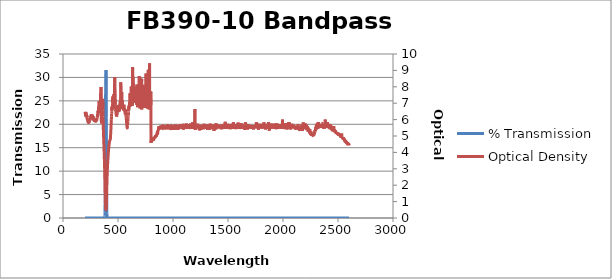
| Category | % Transmission |
|---|---|
| 2600.0 | 0.003 |
| 2599.0 | 0.004 |
| 2598.0 | 0.003 |
| 2597.0 | 0.003 |
| 2596.0 | 0.003 |
| 2595.0 | 0.003 |
| 2594.0 | 0.003 |
| 2593.0 | 0.004 |
| 2592.0 | 0.003 |
| 2591.0 | 0.003 |
| 2590.0 | 0.003 |
| 2589.0 | 0.003 |
| 2588.0 | 0.003 |
| 2587.0 | 0.003 |
| 2586.0 | 0.003 |
| 2585.0 | 0.003 |
| 2584.0 | 0.002 |
| 2583.0 | 0.003 |
| 2582.0 | 0.003 |
| 2581.0 | 0.003 |
| 2580.0 | 0.003 |
| 2579.0 | 0.003 |
| 2578.0 | 0.003 |
| 2577.0 | 0.002 |
| 2576.0 | 0.002 |
| 2575.0 | 0.002 |
| 2574.0 | 0.002 |
| 2573.0 | 0.002 |
| 2572.0 | 0.002 |
| 2571.0 | 0.002 |
| 2570.0 | 0.002 |
| 2569.0 | 0.002 |
| 2568.0 | 0.002 |
| 2567.0 | 0.002 |
| 2566.0 | 0.002 |
| 2565.0 | 0.002 |
| 2564.0 | 0.002 |
| 2563.0 | 0.002 |
| 2562.0 | 0.002 |
| 2561.0 | 0.002 |
| 2560.0 | 0.002 |
| 2559.0 | 0.002 |
| 2558.0 | 0.002 |
| 2557.0 | 0.002 |
| 2556.0 | 0.002 |
| 2555.0 | 0.002 |
| 2554.0 | 0.002 |
| 2553.0 | 0.001 |
| 2552.0 | 0.002 |
| 2551.0 | 0.001 |
| 2550.0 | 0.002 |
| 2549.0 | 0.002 |
| 2548.0 | 0.001 |
| 2547.0 | 0.002 |
| 2546.0 | 0.001 |
| 2545.0 | 0.001 |
| 2544.0 | 0.001 |
| 2543.0 | 0.001 |
| 2542.0 | 0.001 |
| 2541.0 | 0.001 |
| 2540.0 | 0.001 |
| 2539.0 | 0.001 |
| 2538.0 | 0.001 |
| 2537.0 | 0.001 |
| 2536.0 | 0.001 |
| 2535.0 | 0.001 |
| 2534.0 | 0.001 |
| 2533.0 | 0.001 |
| 2532.0 | 0.001 |
| 2531.0 | 0.001 |
| 2530.0 | 0.001 |
| 2529.0 | 0.001 |
| 2528.0 | 0.001 |
| 2527.0 | 0.001 |
| 2526.0 | 0.001 |
| 2525.0 | 0.001 |
| 2524.0 | 0.001 |
| 2523.0 | 0.001 |
| 2522.0 | 0.001 |
| 2521.0 | 0.001 |
| 2520.0 | 0.001 |
| 2519.0 | 0.001 |
| 2518.0 | 0.001 |
| 2517.0 | 0.001 |
| 2516.0 | 0.001 |
| 2515.0 | 0.001 |
| 2514.0 | 0.001 |
| 2513.0 | 0.001 |
| 2512.0 | 0.001 |
| 2511.0 | 0.001 |
| 2510.0 | 0.001 |
| 2509.0 | 0.001 |
| 2508.0 | 0.001 |
| 2507.0 | 0.001 |
| 2506.0 | 0.001 |
| 2505.0 | 0.001 |
| 2504.0 | 0.001 |
| 2503.0 | 0.001 |
| 2502.0 | 0.001 |
| 2501.0 | 0.001 |
| 2500.0 | 0.001 |
| 2499.0 | 0.001 |
| 2498.0 | 0.001 |
| 2497.0 | 0.001 |
| 2496.0 | 0.001 |
| 2495.0 | 0.001 |
| 2494.0 | 0.001 |
| 2493.0 | 0.001 |
| 2492.0 | 0.001 |
| 2491.0 | 0.001 |
| 2490.0 | 0.001 |
| 2489.0 | 0.001 |
| 2488.0 | 0.001 |
| 2487.0 | 0.001 |
| 2486.0 | 0.001 |
| 2485.0 | 0.001 |
| 2484.0 | 0.001 |
| 2483.0 | 0.001 |
| 2482.0 | 0.001 |
| 2481.0 | 0.001 |
| 2480.0 | 0.001 |
| 2479.0 | 0.001 |
| 2478.0 | 0 |
| 2477.0 | 0.001 |
| 2476.0 | 0.001 |
| 2475.0 | 0.001 |
| 2474.0 | 0.001 |
| 2473.0 | 0.001 |
| 2472.0 | 0 |
| 2471.0 | 0.001 |
| 2470.0 | 0 |
| 2469.0 | 0 |
| 2468.0 | 0.001 |
| 2467.0 | 0 |
| 2466.0 | 0 |
| 2465.0 | 0 |
| 2464.0 | 0 |
| 2463.0 | 0 |
| 2462.0 | 0 |
| 2461.0 | 0 |
| 2460.0 | 0 |
| 2459.0 | 0 |
| 2458.0 | 0 |
| 2457.0 | 0.001 |
| 2456.0 | 0 |
| 2455.0 | 0.001 |
| 2454.0 | 0 |
| 2453.0 | 0 |
| 2452.0 | 0 |
| 2451.0 | 0 |
| 2450.0 | 0 |
| 2449.0 | 0 |
| 2448.0 | 0 |
| 2447.0 | 0 |
| 2446.0 | 0 |
| 2445.0 | 0 |
| 2444.0 | 0 |
| 2443.0 | 0 |
| 2442.0 | 0 |
| 2441.0 | 0 |
| 2440.0 | 0 |
| 2439.0 | 0 |
| 2438.0 | 0 |
| 2437.0 | 0 |
| 2436.0 | 0 |
| 2435.0 | 0 |
| 2434.0 | 0 |
| 2433.0 | 0 |
| 2432.0 | 0 |
| 2431.0 | 0 |
| 2430.0 | 0 |
| 2429.0 | 0 |
| 2428.0 | 0 |
| 2427.0 | 0 |
| 2426.0 | 0 |
| 2425.0 | 0 |
| 2424.0 | 0 |
| 2423.0 | 0 |
| 2422.0 | 0 |
| 2421.0 | 0 |
| 2420.0 | 0 |
| 2419.0 | 0 |
| 2418.0 | 0 |
| 2417.0 | 0 |
| 2416.0 | 0 |
| 2415.0 | 0 |
| 2414.0 | 0 |
| 2413.0 | 0 |
| 2412.0 | 0 |
| 2411.0 | 0 |
| 2410.0 | 0 |
| 2409.0 | 0 |
| 2408.0 | 0 |
| 2407.0 | 0 |
| 2406.0 | 0 |
| 2405.0 | 0 |
| 2404.0 | 0 |
| 2403.0 | 0 |
| 2402.0 | 0 |
| 2401.0 | 0 |
| 2400.0 | 0 |
| 2399.0 | 0 |
| 2398.0 | 0 |
| 2397.0 | 0 |
| 2396.0 | 0 |
| 2395.0 | 0 |
| 2394.0 | 0 |
| 2393.0 | 0 |
| 2392.0 | 0 |
| 2391.0 | 0 |
| 2390.0 | 0 |
| 2389.0 | 0 |
| 2388.0 | 0 |
| 2387.0 | 0 |
| 2386.0 | 0 |
| 2385.0 | 0 |
| 2384.0 | 0 |
| 2383.0 | 0 |
| 2382.0 | 0 |
| 2381.0 | 0 |
| 2380.0 | 0 |
| 2379.0 | 0 |
| 2378.0 | 0 |
| 2377.0 | 0 |
| 2376.0 | 0 |
| 2375.0 | 0 |
| 2374.0 | 0 |
| 2373.0 | 0 |
| 2372.0 | 0 |
| 2371.0 | 0 |
| 2370.0 | 0 |
| 2369.0 | 0 |
| 2368.0 | 0 |
| 2367.0 | 0 |
| 2366.0 | 0 |
| 2365.0 | 0 |
| 2364.0 | 0 |
| 2363.0 | 0 |
| 2362.0 | 0 |
| 2361.0 | 0 |
| 2360.0 | 0 |
| 2359.0 | 0 |
| 2358.0 | 0 |
| 2357.0 | 0 |
| 2356.0 | 0 |
| 2355.0 | 0 |
| 2354.0 | 0 |
| 2353.0 | 0 |
| 2352.0 | 0 |
| 2351.0 | 0 |
| 2350.0 | 0 |
| 2349.0 | 0 |
| 2348.0 | 0 |
| 2347.0 | 0 |
| 2346.0 | 0 |
| 2345.0 | 0 |
| 2344.0 | 0 |
| 2343.0 | 0 |
| 2342.0 | 0 |
| 2341.0 | 0 |
| 2340.0 | 0 |
| 2339.0 | 0 |
| 2338.0 | 0 |
| 2337.0 | 0 |
| 2336.0 | 0 |
| 2335.0 | 0 |
| 2334.0 | 0 |
| 2333.0 | 0 |
| 2332.0 | 0 |
| 2331.0 | 0 |
| 2330.0 | 0 |
| 2329.0 | 0 |
| 2328.0 | 0 |
| 2327.0 | 0 |
| 2326.0 | 0 |
| 2325.0 | 0 |
| 2324.0 | 0 |
| 2323.0 | 0 |
| 2322.0 | 0 |
| 2321.0 | 0 |
| 2320.0 | 0 |
| 2319.0 | 0 |
| 2318.0 | 0 |
| 2317.0 | 0 |
| 2316.0 | 0 |
| 2315.0 | 0 |
| 2314.0 | 0 |
| 2313.0 | 0 |
| 2312.0 | 0 |
| 2311.0 | 0 |
| 2310.0 | 0 |
| 2309.0 | 0 |
| 2308.0 | 0 |
| 2307.0 | 0 |
| 2306.0 | 0 |
| 2305.0 | 0 |
| 2304.0 | 0 |
| 2303.0 | 0 |
| 2302.0 | 0 |
| 2301.0 | 0 |
| 2300.0 | 0 |
| 2299.0 | 0 |
| 2298.0 | 0 |
| 2297.0 | 0 |
| 2296.0 | 0 |
| 2295.0 | 0 |
| 2294.0 | 0.001 |
| 2293.0 | 0 |
| 2292.0 | 0.001 |
| 2291.0 | 0 |
| 2290.0 | 0 |
| 2289.0 | 0.001 |
| 2288.0 | 0.001 |
| 2287.0 | 0.001 |
| 2286.0 | 0.001 |
| 2285.0 | 0.001 |
| 2284.0 | 0.001 |
| 2283.0 | 0.001 |
| 2282.0 | 0.001 |
| 2281.0 | 0.001 |
| 2280.0 | 0.001 |
| 2279.0 | 0.001 |
| 2278.0 | 0.001 |
| 2277.0 | 0.001 |
| 2276.0 | 0.001 |
| 2275.0 | 0.001 |
| 2274.0 | 0.001 |
| 2273.0 | 0.001 |
| 2272.0 | 0.001 |
| 2271.0 | 0.001 |
| 2270.0 | 0.001 |
| 2269.0 | 0.001 |
| 2268.0 | 0.001 |
| 2267.0 | 0.001 |
| 2266.0 | 0.001 |
| 2265.0 | 0.001 |
| 2264.0 | 0.001 |
| 2263.0 | 0.001 |
| 2262.0 | 0.001 |
| 2261.0 | 0.001 |
| 2260.0 | 0.001 |
| 2259.0 | 0.001 |
| 2258.0 | 0.001 |
| 2257.0 | 0.001 |
| 2256.0 | 0.001 |
| 2255.0 | 0.001 |
| 2254.0 | 0.001 |
| 2253.0 | 0.001 |
| 2252.0 | 0.001 |
| 2251.0 | 0.001 |
| 2250.0 | 0.001 |
| 2249.0 | 0.001 |
| 2248.0 | 0.001 |
| 2247.0 | 0.001 |
| 2246.0 | 0.001 |
| 2245.0 | 0.001 |
| 2244.0 | 0.001 |
| 2243.0 | 0 |
| 2242.0 | 0.001 |
| 2241.0 | 0.001 |
| 2240.0 | 0 |
| 2239.0 | 0.001 |
| 2238.0 | 0 |
| 2237.0 | 0 |
| 2236.0 | 0 |
| 2235.0 | 0.001 |
| 2234.0 | 0 |
| 2233.0 | 0 |
| 2232.0 | 0 |
| 2231.0 | 0 |
| 2230.0 | 0 |
| 2229.0 | 0.001 |
| 2228.0 | 0 |
| 2227.0 | 0 |
| 2226.0 | 0 |
| 2225.0 | 0 |
| 2224.0 | 0 |
| 2223.0 | 0 |
| 2222.0 | 0 |
| 2221.0 | 0 |
| 2220.0 | 0 |
| 2219.0 | 0 |
| 2218.0 | 0 |
| 2217.0 | 0 |
| 2216.0 | 0 |
| 2215.0 | 0 |
| 2214.0 | 0 |
| 2213.0 | 0 |
| 2212.0 | 0 |
| 2211.0 | 0 |
| 2210.0 | 0 |
| 2209.0 | 0 |
| 2208.0 | 0 |
| 2207.0 | 0 |
| 2206.0 | 0 |
| 2205.0 | 0 |
| 2204.0 | 0 |
| 2203.0 | 0 |
| 2202.0 | 0 |
| 2201.0 | 0 |
| 2200.0 | 0 |
| 2199.0 | 0 |
| 2198.0 | 0 |
| 2197.0 | 0 |
| 2196.0 | 0 |
| 2195.0 | 0 |
| 2194.0 | 0 |
| 2193.0 | 0 |
| 2192.0 | 0 |
| 2191.0 | 0 |
| 2190.0 | 0 |
| 2189.0 | 0 |
| 2188.0 | 0 |
| 2187.0 | 0 |
| 2186.0 | 0 |
| 2185.0 | 0 |
| 2184.0 | 0 |
| 2183.0 | 0 |
| 2182.0 | 0 |
| 2181.0 | 0 |
| 2180.0 | 0 |
| 2179.0 | 0 |
| 2178.0 | 0 |
| 2177.0 | 0 |
| 2176.0 | 0 |
| 2175.0 | 0 |
| 2174.0 | 0 |
| 2173.0 | 0 |
| 2172.0 | 0 |
| 2171.0 | 0 |
| 2170.0 | 0 |
| 2169.0 | 0 |
| 2168.0 | 0 |
| 2167.0 | 0 |
| 2166.0 | 0 |
| 2165.0 | 0 |
| 2164.0 | 0 |
| 2163.0 | 0 |
| 2162.0 | 0 |
| 2161.0 | 0 |
| 2160.0 | 0 |
| 2159.0 | 0 |
| 2158.0 | 0 |
| 2157.0 | 0 |
| 2156.0 | 0 |
| 2155.0 | 0 |
| 2154.0 | 0 |
| 2153.0 | 0 |
| 2152.0 | 0 |
| 2151.0 | 0 |
| 2150.0 | 0 |
| 2149.0 | 0 |
| 2148.0 | 0 |
| 2147.0 | 0 |
| 2146.0 | 0 |
| 2145.0 | 0 |
| 2144.0 | 0 |
| 2143.0 | 0 |
| 2142.0 | 0 |
| 2141.0 | 0 |
| 2140.0 | 0 |
| 2139.0 | 0 |
| 2138.0 | 0 |
| 2137.0 | 0 |
| 2136.0 | 0 |
| 2135.0 | 0 |
| 2134.0 | 0 |
| 2133.0 | 0 |
| 2132.0 | 0 |
| 2131.0 | 0 |
| 2130.0 | 0 |
| 2129.0 | 0 |
| 2128.0 | 0 |
| 2127.0 | 0 |
| 2126.0 | 0 |
| 2125.0 | 0 |
| 2124.0 | 0 |
| 2123.0 | 0 |
| 2122.0 | 0 |
| 2121.0 | 0 |
| 2120.0 | 0 |
| 2119.0 | 0 |
| 2118.0 | 0 |
| 2117.0 | 0 |
| 2116.0 | 0 |
| 2115.0 | 0 |
| 2114.0 | 0 |
| 2113.0 | 0 |
| 2112.0 | 0 |
| 2111.0 | 0 |
| 2110.0 | 0 |
| 2109.0 | 0 |
| 2108.0 | 0 |
| 2107.0 | 0 |
| 2106.0 | 0 |
| 2105.0 | 0 |
| 2104.0 | 0 |
| 2103.0 | 0 |
| 2102.0 | 0 |
| 2101.0 | 0 |
| 2100.0 | 0 |
| 2099.0 | 0 |
| 2098.0 | 0 |
| 2097.0 | 0 |
| 2096.0 | 0 |
| 2095.0 | 0 |
| 2094.0 | 0 |
| 2093.0 | 0 |
| 2092.0 | 0 |
| 2091.0 | 0 |
| 2090.0 | 0 |
| 2089.0 | 0 |
| 2088.0 | 0 |
| 2087.0 | 0 |
| 2086.0 | 0 |
| 2085.0 | 0 |
| 2084.0 | 0 |
| 2083.0 | 0 |
| 2082.0 | 0 |
| 2081.0 | 0 |
| 2080.0 | 0 |
| 2079.0 | 0 |
| 2078.0 | 0 |
| 2077.0 | 0 |
| 2076.0 | 0 |
| 2075.0 | 0 |
| 2074.0 | 0 |
| 2073.0 | 0 |
| 2072.0 | 0 |
| 2071.0 | 0 |
| 2070.0 | 0 |
| 2069.0 | 0 |
| 2068.0 | 0 |
| 2067.0 | 0 |
| 2066.0 | 0 |
| 2065.0 | 0 |
| 2064.0 | 0 |
| 2063.0 | 0 |
| 2062.0 | 0 |
| 2061.0 | 0 |
| 2060.0 | 0 |
| 2059.0 | 0 |
| 2058.0 | 0 |
| 2057.0 | 0 |
| 2056.0 | 0 |
| 2055.0 | 0 |
| 2054.0 | 0 |
| 2053.0 | 0 |
| 2052.0 | 0 |
| 2051.0 | 0 |
| 2050.0 | 0 |
| 2049.0 | 0 |
| 2048.0 | 0 |
| 2047.0 | 0 |
| 2046.0 | 0 |
| 2045.0 | 0 |
| 2044.0 | 0 |
| 2043.0 | 0 |
| 2042.0 | 0 |
| 2041.0 | 0 |
| 2040.0 | 0 |
| 2039.0 | 0 |
| 2038.0 | 0 |
| 2037.0 | 0 |
| 2036.0 | 0 |
| 2035.0 | 0 |
| 2034.0 | 0 |
| 2033.0 | 0 |
| 2032.0 | 0 |
| 2031.0 | 0 |
| 2030.0 | 0 |
| 2029.0 | 0 |
| 2028.0 | 0 |
| 2027.0 | 0 |
| 2026.0 | 0 |
| 2025.0 | 0 |
| 2024.0 | 0 |
| 2023.0 | 0 |
| 2022.0 | 0 |
| 2021.0 | 0 |
| 2020.0 | 0 |
| 2019.0 | 0 |
| 2018.0 | 0 |
| 2017.0 | 0 |
| 2016.0 | 0 |
| 2015.0 | 0 |
| 2014.0 | 0 |
| 2013.0 | 0 |
| 2012.0 | 0 |
| 2011.0 | 0 |
| 2010.0 | 0 |
| 2009.0 | 0 |
| 2008.0 | 0 |
| 2007.0 | 0 |
| 2006.0 | 0 |
| 2005.0 | 0 |
| 2004.0 | 0 |
| 2003.0 | 0 |
| 2002.0 | 0 |
| 2001.0 | 0 |
| 2000.0 | 0 |
| 1999.0 | 0 |
| 1998.0 | 0 |
| 1997.0 | 0 |
| 1996.0 | 0 |
| 1995.0 | 0 |
| 1994.0 | 0 |
| 1993.0 | 0 |
| 1992.0 | 0 |
| 1991.0 | 0 |
| 1990.0 | 0 |
| 1989.0 | 0 |
| 1988.0 | 0 |
| 1987.0 | 0 |
| 1986.0 | 0 |
| 1985.0 | 0 |
| 1984.0 | 0 |
| 1983.0 | 0 |
| 1982.0 | 0 |
| 1981.0 | 0 |
| 1980.0 | 0 |
| 1979.0 | 0 |
| 1978.0 | 0 |
| 1977.0 | 0 |
| 1976.0 | 0 |
| 1975.0 | 0 |
| 1974.0 | 0 |
| 1973.0 | 0 |
| 1972.0 | 0 |
| 1971.0 | 0 |
| 1970.0 | 0 |
| 1969.0 | 0 |
| 1968.0 | 0 |
| 1967.0 | 0 |
| 1966.0 | 0 |
| 1965.0 | 0 |
| 1964.0 | 0 |
| 1963.0 | 0 |
| 1962.0 | 0 |
| 1961.0 | 0 |
| 1960.0 | 0 |
| 1959.0 | 0 |
| 1958.0 | 0 |
| 1957.0 | 0 |
| 1956.0 | 0 |
| 1955.0 | 0 |
| 1954.0 | 0 |
| 1953.0 | 0 |
| 1952.0 | 0 |
| 1951.0 | 0 |
| 1950.0 | 0 |
| 1949.0 | 0 |
| 1948.0 | 0 |
| 1947.0 | 0 |
| 1946.0 | 0 |
| 1945.0 | 0 |
| 1944.0 | 0 |
| 1943.0 | 0 |
| 1942.0 | 0 |
| 1941.0 | 0 |
| 1940.0 | 0 |
| 1939.0 | 0 |
| 1938.0 | 0 |
| 1937.0 | 0 |
| 1936.0 | 0 |
| 1935.0 | 0 |
| 1934.0 | 0 |
| 1933.0 | 0 |
| 1932.0 | 0 |
| 1931.0 | 0 |
| 1930.0 | 0 |
| 1929.0 | 0 |
| 1928.0 | 0 |
| 1927.0 | 0 |
| 1926.0 | 0 |
| 1925.0 | 0 |
| 1924.0 | 0 |
| 1923.0 | 0 |
| 1922.0 | 0 |
| 1921.0 | 0 |
| 1920.0 | 0 |
| 1919.0 | 0 |
| 1918.0 | 0 |
| 1917.0 | 0 |
| 1916.0 | 0 |
| 1915.0 | 0 |
| 1914.0 | 0 |
| 1913.0 | 0 |
| 1912.0 | 0 |
| 1911.0 | 0 |
| 1910.0 | 0 |
| 1909.0 | 0 |
| 1908.0 | 0 |
| 1907.0 | 0 |
| 1906.0 | 0 |
| 1905.0 | 0 |
| 1904.0 | 0 |
| 1903.0 | 0 |
| 1902.0 | 0 |
| 1901.0 | 0 |
| 1900.0 | 0 |
| 1899.0 | 0 |
| 1898.0 | 0 |
| 1897.0 | 0 |
| 1896.0 | 0 |
| 1895.0 | 0 |
| 1894.0 | 0 |
| 1893.0 | 0 |
| 1892.0 | 0 |
| 1891.0 | 0 |
| 1890.0 | 0 |
| 1889.0 | 0 |
| 1888.0 | 0 |
| 1887.0 | 0 |
| 1886.0 | 0 |
| 1885.0 | 0 |
| 1884.0 | 0 |
| 1883.0 | 0 |
| 1882.0 | 0 |
| 1881.0 | 0 |
| 1880.0 | 0 |
| 1879.0 | 0 |
| 1878.0 | 0 |
| 1877.0 | 0 |
| 1876.0 | 0 |
| 1875.0 | 0 |
| 1874.0 | 0 |
| 1873.0 | 0 |
| 1872.0 | 0 |
| 1871.0 | 0 |
| 1870.0 | 0 |
| 1869.0 | 0 |
| 1868.0 | 0 |
| 1867.0 | 0 |
| 1866.0 | 0 |
| 1865.0 | 0 |
| 1864.0 | 0 |
| 1863.0 | 0 |
| 1862.0 | 0 |
| 1861.0 | 0 |
| 1860.0 | 0 |
| 1859.0 | 0 |
| 1858.0 | 0 |
| 1857.0 | 0 |
| 1856.0 | 0 |
| 1855.0 | 0 |
| 1854.0 | 0 |
| 1853.0 | 0 |
| 1852.0 | 0 |
| 1851.0 | 0 |
| 1850.0 | 0 |
| 1849.0 | 0 |
| 1848.0 | 0 |
| 1847.0 | 0 |
| 1846.0 | 0 |
| 1845.0 | 0 |
| 1844.0 | 0 |
| 1843.0 | 0 |
| 1842.0 | 0 |
| 1841.0 | 0 |
| 1840.0 | 0 |
| 1839.0 | 0 |
| 1838.0 | 0 |
| 1837.0 | 0 |
| 1836.0 | 0 |
| 1835.0 | 0 |
| 1834.0 | 0 |
| 1833.0 | 0 |
| 1832.0 | 0 |
| 1831.0 | 0 |
| 1830.0 | 0 |
| 1829.0 | 0 |
| 1828.0 | 0 |
| 1827.0 | 0 |
| 1826.0 | 0 |
| 1825.0 | 0 |
| 1824.0 | 0 |
| 1823.0 | 0 |
| 1822.0 | 0 |
| 1821.0 | 0 |
| 1820.0 | 0 |
| 1819.0 | 0 |
| 1818.0 | 0 |
| 1817.0 | 0 |
| 1816.0 | 0 |
| 1815.0 | 0 |
| 1814.0 | 0 |
| 1813.0 | 0 |
| 1812.0 | 0 |
| 1811.0 | 0 |
| 1810.0 | 0 |
| 1809.0 | 0 |
| 1808.0 | 0 |
| 1807.0 | 0 |
| 1806.0 | 0 |
| 1805.0 | 0 |
| 1804.0 | 0 |
| 1803.0 | 0 |
| 1802.0 | 0 |
| 1801.0 | 0 |
| 1800.0 | 0 |
| 1799.0 | 0 |
| 1798.0 | 0 |
| 1797.0 | 0 |
| 1796.0 | 0 |
| 1795.0 | 0 |
| 1794.0 | 0 |
| 1793.0 | 0 |
| 1792.0 | 0 |
| 1791.0 | 0 |
| 1790.0 | 0 |
| 1789.0 | 0 |
| 1788.0 | 0 |
| 1787.0 | 0 |
| 1786.0 | 0 |
| 1785.0 | 0 |
| 1784.0 | 0 |
| 1783.0 | 0 |
| 1782.0 | 0 |
| 1781.0 | 0 |
| 1780.0 | 0 |
| 1779.0 | 0 |
| 1778.0 | 0 |
| 1777.0 | 0 |
| 1776.0 | 0 |
| 1775.0 | 0 |
| 1774.0 | 0 |
| 1773.0 | 0 |
| 1772.0 | 0 |
| 1771.0 | 0 |
| 1770.0 | 0 |
| 1769.0 | 0 |
| 1768.0 | 0 |
| 1767.0 | 0 |
| 1766.0 | 0 |
| 1765.0 | 0 |
| 1764.0 | 0 |
| 1763.0 | 0 |
| 1762.0 | 0 |
| 1761.0 | 0 |
| 1760.0 | 0 |
| 1759.0 | 0 |
| 1758.0 | 0 |
| 1757.0 | 0 |
| 1756.0 | 0 |
| 1755.0 | 0 |
| 1754.0 | 0 |
| 1753.0 | 0 |
| 1752.0 | 0 |
| 1751.0 | 0 |
| 1750.0 | 0 |
| 1749.0 | 0 |
| 1748.0 | 0 |
| 1747.0 | 0 |
| 1746.0 | 0 |
| 1745.0 | 0 |
| 1744.0 | 0 |
| 1743.0 | 0 |
| 1742.0 | 0 |
| 1741.0 | 0 |
| 1740.0 | 0 |
| 1739.0 | 0 |
| 1738.0 | 0 |
| 1737.0 | 0 |
| 1736.0 | 0 |
| 1735.0 | 0 |
| 1734.0 | 0 |
| 1733.0 | 0 |
| 1732.0 | 0 |
| 1731.0 | 0 |
| 1730.0 | 0 |
| 1729.0 | 0 |
| 1728.0 | 0 |
| 1727.0 | 0 |
| 1726.0 | 0 |
| 1725.0 | 0 |
| 1724.0 | 0 |
| 1723.0 | 0 |
| 1722.0 | 0 |
| 1721.0 | 0 |
| 1720.0 | 0 |
| 1719.0 | 0 |
| 1718.0 | 0 |
| 1717.0 | 0 |
| 1716.0 | 0 |
| 1715.0 | 0 |
| 1714.0 | 0 |
| 1713.0 | 0 |
| 1712.0 | 0 |
| 1711.0 | 0 |
| 1710.0 | 0 |
| 1709.0 | 0 |
| 1708.0 | 0 |
| 1707.0 | 0 |
| 1706.0 | 0 |
| 1705.0 | 0 |
| 1704.0 | 0 |
| 1703.0 | 0 |
| 1702.0 | 0 |
| 1701.0 | 0 |
| 1700.0 | 0 |
| 1699.0 | 0 |
| 1698.0 | 0 |
| 1697.0 | 0 |
| 1696.0 | 0 |
| 1695.0 | 0 |
| 1694.0 | 0 |
| 1693.0 | 0 |
| 1692.0 | 0 |
| 1691.0 | 0 |
| 1690.0 | 0 |
| 1689.0 | 0 |
| 1688.0 | 0 |
| 1687.0 | 0 |
| 1686.0 | 0 |
| 1685.0 | 0 |
| 1684.0 | 0 |
| 1683.0 | 0 |
| 1682.0 | 0 |
| 1681.0 | 0 |
| 1680.0 | 0 |
| 1679.0 | 0 |
| 1678.0 | 0 |
| 1677.0 | 0 |
| 1676.0 | 0 |
| 1675.0 | 0 |
| 1674.0 | 0 |
| 1673.0 | 0 |
| 1672.0 | 0 |
| 1671.0 | 0 |
| 1670.0 | 0 |
| 1669.0 | 0 |
| 1668.0 | 0 |
| 1667.0 | 0 |
| 1666.0 | 0 |
| 1665.0 | 0 |
| 1664.0 | 0 |
| 1663.0 | 0 |
| 1662.0 | 0 |
| 1661.0 | 0 |
| 1660.0 | 0 |
| 1659.0 | 0 |
| 1658.0 | 0 |
| 1657.0 | 0 |
| 1656.0 | 0 |
| 1655.0 | 0 |
| 1654.0 | 0 |
| 1653.0 | 0 |
| 1652.0 | 0 |
| 1651.0 | 0 |
| 1650.0 | 0 |
| 1649.0 | 0 |
| 1648.0 | 0 |
| 1647.0 | 0 |
| 1646.0 | 0 |
| 1645.0 | 0 |
| 1644.0 | 0 |
| 1643.0 | 0 |
| 1642.0 | 0 |
| 1641.0 | 0 |
| 1640.0 | 0 |
| 1639.0 | 0 |
| 1638.0 | 0 |
| 1637.0 | 0 |
| 1636.0 | 0 |
| 1635.0 | 0 |
| 1634.0 | 0 |
| 1633.0 | 0 |
| 1632.0 | 0 |
| 1631.0 | 0 |
| 1630.0 | 0 |
| 1629.0 | 0 |
| 1628.0 | 0 |
| 1627.0 | 0 |
| 1626.0 | 0 |
| 1625.0 | 0 |
| 1624.0 | 0 |
| 1623.0 | 0 |
| 1622.0 | 0 |
| 1621.0 | 0 |
| 1620.0 | 0 |
| 1619.0 | 0 |
| 1618.0 | 0 |
| 1617.0 | 0 |
| 1616.0 | 0 |
| 1615.0 | 0 |
| 1614.0 | 0 |
| 1613.0 | 0 |
| 1612.0 | 0 |
| 1611.0 | 0 |
| 1610.0 | 0 |
| 1609.0 | 0 |
| 1608.0 | 0 |
| 1607.0 | 0 |
| 1606.0 | 0 |
| 1605.0 | 0 |
| 1604.0 | 0 |
| 1603.0 | 0 |
| 1602.0 | 0 |
| 1601.0 | 0 |
| 1600.0 | 0 |
| 1599.0 | 0 |
| 1598.0 | 0 |
| 1597.0 | 0 |
| 1596.0 | 0 |
| 1595.0 | 0 |
| 1594.0 | 0 |
| 1593.0 | 0 |
| 1592.0 | 0 |
| 1591.0 | 0 |
| 1590.0 | 0 |
| 1589.0 | 0 |
| 1588.0 | 0 |
| 1587.0 | 0 |
| 1586.0 | 0 |
| 1585.0 | 0 |
| 1584.0 | 0 |
| 1583.0 | 0 |
| 1582.0 | 0 |
| 1581.0 | 0 |
| 1580.0 | 0 |
| 1579.0 | 0 |
| 1578.0 | 0 |
| 1577.0 | 0 |
| 1576.0 | 0 |
| 1575.0 | 0 |
| 1574.0 | 0 |
| 1573.0 | 0 |
| 1572.0 | 0 |
| 1571.0 | 0 |
| 1570.0 | 0 |
| 1569.0 | 0 |
| 1568.0 | 0 |
| 1567.0 | 0 |
| 1566.0 | 0 |
| 1565.0 | 0 |
| 1564.0 | 0 |
| 1563.0 | 0 |
| 1562.0 | 0 |
| 1561.0 | 0 |
| 1560.0 | 0 |
| 1559.0 | 0 |
| 1558.0 | 0 |
| 1557.0 | 0 |
| 1556.0 | 0 |
| 1555.0 | 0 |
| 1554.0 | 0 |
| 1553.0 | 0 |
| 1552.0 | 0 |
| 1551.0 | 0 |
| 1550.0 | 0 |
| 1549.0 | 0 |
| 1548.0 | 0 |
| 1547.0 | 0 |
| 1546.0 | 0 |
| 1545.0 | 0 |
| 1544.0 | 0 |
| 1543.0 | 0 |
| 1542.0 | 0 |
| 1541.0 | 0 |
| 1540.0 | 0 |
| 1539.0 | 0 |
| 1538.0 | 0 |
| 1537.0 | 0 |
| 1536.0 | 0 |
| 1535.0 | 0 |
| 1534.0 | 0 |
| 1533.0 | 0 |
| 1532.0 | 0 |
| 1531.0 | 0 |
| 1530.0 | 0 |
| 1529.0 | 0 |
| 1528.0 | 0 |
| 1527.0 | 0 |
| 1526.0 | 0 |
| 1525.0 | 0 |
| 1524.0 | 0 |
| 1523.0 | 0 |
| 1522.0 | 0 |
| 1521.0 | 0 |
| 1520.0 | 0 |
| 1519.0 | 0 |
| 1518.0 | 0 |
| 1517.0 | 0 |
| 1516.0 | 0 |
| 1515.0 | 0 |
| 1514.0 | 0 |
| 1513.0 | 0 |
| 1512.0 | 0 |
| 1511.0 | 0 |
| 1510.0 | 0 |
| 1509.0 | 0 |
| 1508.0 | 0 |
| 1507.0 | 0 |
| 1506.0 | 0 |
| 1505.0 | 0 |
| 1504.0 | 0 |
| 1503.0 | 0 |
| 1502.0 | 0 |
| 1501.0 | 0 |
| 1500.0 | 0 |
| 1499.0 | 0 |
| 1498.0 | 0 |
| 1497.0 | 0 |
| 1496.0 | 0 |
| 1495.0 | 0 |
| 1494.0 | 0 |
| 1493.0 | 0 |
| 1492.0 | 0 |
| 1491.0 | 0 |
| 1490.0 | 0 |
| 1489.0 | 0 |
| 1488.0 | 0 |
| 1487.0 | 0 |
| 1486.0 | 0 |
| 1485.0 | 0 |
| 1484.0 | 0 |
| 1483.0 | 0 |
| 1482.0 | 0 |
| 1481.0 | 0 |
| 1480.0 | 0 |
| 1479.0 | 0 |
| 1478.0 | 0 |
| 1477.0 | 0 |
| 1476.0 | 0 |
| 1475.0 | 0 |
| 1474.0 | 0 |
| 1473.0 | 0 |
| 1472.0 | 0 |
| 1471.0 | 0 |
| 1470.0 | 0 |
| 1469.0 | 0 |
| 1468.0 | 0 |
| 1467.0 | 0 |
| 1466.0 | 0 |
| 1465.0 | 0 |
| 1464.0 | 0 |
| 1463.0 | 0 |
| 1462.0 | 0 |
| 1461.0 | 0 |
| 1460.0 | 0 |
| 1459.0 | 0 |
| 1458.0 | 0 |
| 1457.0 | 0 |
| 1456.0 | 0 |
| 1455.0 | 0 |
| 1454.0 | 0 |
| 1453.0 | 0 |
| 1452.0 | 0 |
| 1451.0 | 0 |
| 1450.0 | 0 |
| 1449.0 | 0 |
| 1448.0 | 0 |
| 1447.0 | 0 |
| 1446.0 | 0 |
| 1445.0 | 0 |
| 1444.0 | 0 |
| 1443.0 | 0 |
| 1442.0 | 0 |
| 1441.0 | 0 |
| 1440.0 | 0 |
| 1439.0 | 0 |
| 1438.0 | 0 |
| 1437.0 | 0 |
| 1436.0 | 0 |
| 1435.0 | 0 |
| 1434.0 | 0 |
| 1433.0 | 0 |
| 1432.0 | 0 |
| 1431.0 | 0 |
| 1430.0 | 0 |
| 1429.0 | 0 |
| 1428.0 | 0 |
| 1427.0 | 0 |
| 1426.0 | 0 |
| 1425.0 | 0 |
| 1424.0 | 0 |
| 1423.0 | 0 |
| 1422.0 | 0 |
| 1421.0 | 0 |
| 1420.0 | 0 |
| 1419.0 | 0 |
| 1418.0 | 0 |
| 1417.0 | 0 |
| 1416.0 | 0 |
| 1415.0 | 0 |
| 1414.0 | 0 |
| 1413.0 | 0 |
| 1412.0 | 0 |
| 1411.0 | 0 |
| 1410.0 | 0 |
| 1409.0 | 0 |
| 1408.0 | 0 |
| 1407.0 | 0 |
| 1406.0 | 0 |
| 1405.0 | 0 |
| 1404.0 | 0 |
| 1403.0 | 0 |
| 1402.0 | 0 |
| 1401.0 | 0 |
| 1400.0 | 0 |
| 1399.0 | 0 |
| 1398.0 | 0 |
| 1397.0 | 0 |
| 1396.0 | 0 |
| 1395.0 | 0 |
| 1394.0 | 0 |
| 1393.0 | 0 |
| 1392.0 | 0 |
| 1391.0 | 0 |
| 1390.0 | 0 |
| 1389.0 | 0 |
| 1388.0 | 0 |
| 1387.0 | 0 |
| 1386.0 | 0 |
| 1385.0 | 0 |
| 1384.0 | 0 |
| 1383.0 | 0 |
| 1382.0 | 0 |
| 1381.0 | 0 |
| 1380.0 | 0 |
| 1379.0 | 0 |
| 1378.0 | 0 |
| 1377.0 | 0 |
| 1376.0 | 0 |
| 1375.0 | 0 |
| 1374.0 | 0 |
| 1373.0 | 0 |
| 1372.0 | 0 |
| 1371.0 | 0 |
| 1370.0 | 0 |
| 1369.0 | 0 |
| 1368.0 | 0 |
| 1367.0 | 0 |
| 1366.0 | 0 |
| 1365.0 | 0 |
| 1364.0 | 0 |
| 1363.0 | 0 |
| 1362.0 | 0 |
| 1361.0 | 0 |
| 1360.0 | 0 |
| 1359.0 | 0 |
| 1358.0 | 0 |
| 1357.0 | 0 |
| 1356.0 | 0 |
| 1355.0 | 0 |
| 1354.0 | 0 |
| 1353.0 | 0 |
| 1352.0 | 0 |
| 1351.0 | 0 |
| 1350.0 | 0 |
| 1349.0 | 0 |
| 1348.0 | 0 |
| 1347.0 | 0 |
| 1346.0 | 0 |
| 1345.0 | 0 |
| 1344.0 | 0 |
| 1343.0 | 0 |
| 1342.0 | 0 |
| 1341.0 | 0 |
| 1340.0 | 0 |
| 1339.0 | 0 |
| 1338.0 | 0 |
| 1337.0 | 0 |
| 1336.0 | 0 |
| 1335.0 | 0 |
| 1334.0 | 0 |
| 1333.0 | 0 |
| 1332.0 | 0 |
| 1331.0 | 0 |
| 1330.0 | 0 |
| 1329.0 | 0 |
| 1328.0 | 0 |
| 1327.0 | 0 |
| 1326.0 | 0 |
| 1325.0 | 0 |
| 1324.0 | 0 |
| 1323.0 | 0 |
| 1322.0 | 0 |
| 1321.0 | 0 |
| 1320.0 | 0 |
| 1319.0 | 0 |
| 1318.0 | 0 |
| 1317.0 | 0 |
| 1316.0 | 0 |
| 1315.0 | 0 |
| 1314.0 | 0 |
| 1313.0 | 0 |
| 1312.0 | 0 |
| 1311.0 | 0 |
| 1310.0 | 0 |
| 1309.0 | 0 |
| 1308.0 | 0 |
| 1307.0 | 0 |
| 1306.0 | 0 |
| 1305.0 | 0 |
| 1304.0 | 0 |
| 1303.0 | 0 |
| 1302.0 | 0 |
| 1301.0 | 0 |
| 1300.0 | 0 |
| 1299.0 | 0 |
| 1298.0 | 0 |
| 1297.0 | 0 |
| 1296.0 | 0 |
| 1295.0 | 0 |
| 1294.0 | 0 |
| 1293.0 | 0 |
| 1292.0 | 0 |
| 1291.0 | 0 |
| 1290.0 | 0 |
| 1289.0 | 0 |
| 1288.0 | 0 |
| 1287.0 | 0 |
| 1286.0 | 0 |
| 1285.0 | 0 |
| 1284.0 | 0 |
| 1283.0 | 0 |
| 1282.0 | 0 |
| 1281.0 | 0 |
| 1280.0 | 0 |
| 1279.0 | 0 |
| 1278.0 | 0 |
| 1277.0 | 0 |
| 1276.0 | 0 |
| 1275.0 | 0 |
| 1274.0 | 0 |
| 1273.0 | 0 |
| 1272.0 | 0 |
| 1271.0 | 0 |
| 1270.0 | 0 |
| 1269.0 | 0 |
| 1268.0 | 0 |
| 1267.0 | 0 |
| 1266.0 | 0 |
| 1265.0 | 0 |
| 1264.0 | 0 |
| 1263.0 | 0 |
| 1262.0 | 0 |
| 1261.0 | 0 |
| 1260.0 | 0 |
| 1259.0 | 0 |
| 1258.0 | 0 |
| 1257.0 | 0 |
| 1256.0 | 0 |
| 1255.0 | 0 |
| 1254.0 | 0 |
| 1253.0 | 0 |
| 1252.0 | 0 |
| 1251.0 | 0 |
| 1250.0 | 0 |
| 1249.0 | 0 |
| 1248.0 | 0 |
| 1247.0 | 0 |
| 1246.0 | 0 |
| 1245.0 | 0 |
| 1244.0 | 0 |
| 1243.0 | 0 |
| 1242.0 | 0 |
| 1241.0 | 0 |
| 1240.0 | 0 |
| 1239.0 | 0 |
| 1238.0 | 0 |
| 1237.0 | 0 |
| 1236.0 | 0 |
| 1235.0 | 0 |
| 1234.0 | 0 |
| 1233.0 | 0 |
| 1232.0 | 0 |
| 1231.0 | 0 |
| 1230.0 | 0 |
| 1229.0 | 0 |
| 1228.0 | 0 |
| 1227.0 | 0 |
| 1226.0 | 0 |
| 1225.0 | 0 |
| 1224.0 | 0 |
| 1223.0 | 0 |
| 1222.0 | 0 |
| 1221.0 | 0 |
| 1220.0 | 0 |
| 1219.0 | 0 |
| 1218.0 | 0 |
| 1217.0 | 0 |
| 1216.0 | 0 |
| 1215.0 | 0 |
| 1214.0 | 0 |
| 1213.0 | 0 |
| 1212.0 | 0 |
| 1211.0 | 0 |
| 1210.0 | 0 |
| 1209.0 | 0 |
| 1208.0 | 0 |
| 1207.0 | 0 |
| 1206.0 | 0 |
| 1205.0 | 0 |
| 1204.0 | 0 |
| 1203.0 | 0 |
| 1202.0 | 0 |
| 1201.0 | 0 |
| 1200.0 | 0 |
| 1199.0 | 0 |
| 1198.0 | 0 |
| 1197.0 | 0 |
| 1196.0 | 0 |
| 1195.0 | 0 |
| 1194.0 | 0 |
| 1193.0 | 0 |
| 1192.0 | 0 |
| 1191.0 | 0 |
| 1190.0 | 0 |
| 1189.0 | 0 |
| 1188.0 | 0 |
| 1187.0 | 0 |
| 1186.0 | 0 |
| 1185.0 | 0 |
| 1184.0 | 0 |
| 1183.0 | 0 |
| 1182.0 | 0 |
| 1181.0 | 0 |
| 1180.0 | 0 |
| 1179.0 | 0 |
| 1178.0 | 0 |
| 1177.0 | 0 |
| 1176.0 | 0 |
| 1175.0 | 0 |
| 1174.0 | 0 |
| 1173.0 | 0 |
| 1172.0 | 0 |
| 1171.0 | 0 |
| 1170.0 | 0 |
| 1169.0 | 0 |
| 1168.0 | 0 |
| 1167.0 | 0 |
| 1166.0 | 0 |
| 1165.0 | 0 |
| 1164.0 | 0 |
| 1163.0 | 0 |
| 1162.0 | 0 |
| 1161.0 | 0 |
| 1160.0 | 0 |
| 1159.0 | 0 |
| 1158.0 | 0 |
| 1157.0 | 0 |
| 1156.0 | 0 |
| 1155.0 | 0 |
| 1154.0 | 0 |
| 1153.0 | 0 |
| 1152.0 | 0 |
| 1151.0 | 0 |
| 1150.0 | 0 |
| 1149.0 | 0 |
| 1148.0 | 0 |
| 1147.0 | 0 |
| 1146.0 | 0 |
| 1145.0 | 0 |
| 1144.0 | 0 |
| 1143.0 | 0 |
| 1142.0 | 0 |
| 1141.0 | 0 |
| 1140.0 | 0 |
| 1139.0 | 0 |
| 1138.0 | 0 |
| 1137.0 | 0 |
| 1136.0 | 0 |
| 1135.0 | 0 |
| 1134.0 | 0 |
| 1133.0 | 0 |
| 1132.0 | 0 |
| 1131.0 | 0 |
| 1130.0 | 0 |
| 1129.0 | 0 |
| 1128.0 | 0 |
| 1127.0 | 0 |
| 1126.0 | 0 |
| 1125.0 | 0 |
| 1124.0 | 0 |
| 1123.0 | 0 |
| 1122.0 | 0 |
| 1121.0 | 0 |
| 1120.0 | 0 |
| 1119.0 | 0 |
| 1118.0 | 0 |
| 1117.0 | 0 |
| 1116.0 | 0 |
| 1115.0 | 0 |
| 1114.0 | 0 |
| 1113.0 | 0 |
| 1112.0 | 0 |
| 1111.0 | 0 |
| 1110.0 | 0 |
| 1109.0 | 0 |
| 1108.0 | 0 |
| 1107.0 | 0 |
| 1106.0 | 0 |
| 1105.0 | 0 |
| 1104.0 | 0 |
| 1103.0 | 0 |
| 1102.0 | 0 |
| 1101.0 | 0 |
| 1100.0 | 0 |
| 1099.0 | 0 |
| 1098.0 | 0 |
| 1097.0 | 0 |
| 1096.0 | 0 |
| 1095.0 | 0 |
| 1094.0 | 0 |
| 1093.0 | 0 |
| 1092.0 | 0 |
| 1091.0 | 0 |
| 1090.0 | 0 |
| 1089.0 | 0 |
| 1088.0 | 0 |
| 1087.0 | 0 |
| 1086.0 | 0 |
| 1085.0 | 0 |
| 1084.0 | 0 |
| 1083.0 | 0 |
| 1082.0 | 0 |
| 1081.0 | 0 |
| 1080.0 | 0 |
| 1079.0 | 0 |
| 1078.0 | 0 |
| 1077.0 | 0 |
| 1076.0 | 0 |
| 1075.0 | 0 |
| 1074.0 | 0 |
| 1073.0 | 0 |
| 1072.0 | 0 |
| 1071.0 | 0 |
| 1070.0 | 0 |
| 1069.0 | 0 |
| 1068.0 | 0 |
| 1067.0 | 0 |
| 1066.0 | 0 |
| 1065.0 | 0 |
| 1064.0 | 0 |
| 1063.0 | 0 |
| 1062.0 | 0 |
| 1061.0 | 0 |
| 1060.0 | 0 |
| 1059.0 | 0 |
| 1058.0 | 0 |
| 1057.0 | 0 |
| 1056.0 | 0 |
| 1055.0 | 0 |
| 1054.0 | 0 |
| 1053.0 | 0 |
| 1052.0 | 0 |
| 1051.0 | 0 |
| 1050.0 | 0 |
| 1049.0 | 0 |
| 1048.0 | 0 |
| 1047.0 | 0 |
| 1046.0 | 0 |
| 1045.0 | 0 |
| 1044.0 | 0 |
| 1043.0 | 0 |
| 1042.0 | 0 |
| 1041.0 | 0 |
| 1040.0 | 0 |
| 1039.0 | 0 |
| 1038.0 | 0 |
| 1037.0 | 0 |
| 1036.0 | 0 |
| 1035.0 | 0 |
| 1034.0 | 0 |
| 1033.0 | 0 |
| 1032.0 | 0 |
| 1031.0 | 0 |
| 1030.0 | 0 |
| 1029.0 | 0 |
| 1028.0 | 0 |
| 1027.0 | 0 |
| 1026.0 | 0 |
| 1025.0 | 0 |
| 1024.0 | 0 |
| 1023.0 | 0 |
| 1022.0 | 0 |
| 1021.0 | 0 |
| 1020.0 | 0 |
| 1019.0 | 0 |
| 1018.0 | 0 |
| 1017.0 | 0 |
| 1016.0 | 0 |
| 1015.0 | 0 |
| 1014.0 | 0 |
| 1013.0 | 0 |
| 1012.0 | 0 |
| 1011.0 | 0 |
| 1010.0 | 0 |
| 1009.0 | 0 |
| 1008.0 | 0 |
| 1007.0 | 0 |
| 1006.0 | 0 |
| 1005.0 | 0 |
| 1004.0 | 0 |
| 1003.0 | 0 |
| 1002.0 | 0 |
| 1001.0 | 0 |
| 1000.0 | 0 |
| 999.0 | 0 |
| 998.0 | 0 |
| 997.0 | 0 |
| 996.0 | 0 |
| 995.0 | 0 |
| 994.0 | 0 |
| 993.0 | 0 |
| 992.0 | 0 |
| 991.0 | 0 |
| 990.0 | 0 |
| 989.0 | 0 |
| 988.0 | 0 |
| 987.0 | 0 |
| 986.0 | 0 |
| 985.0 | 0 |
| 984.0 | 0 |
| 983.0 | 0 |
| 982.0 | 0 |
| 981.0 | 0 |
| 980.0 | 0 |
| 979.0 | 0 |
| 978.0 | 0 |
| 977.0 | 0 |
| 976.0 | 0 |
| 975.0 | 0 |
| 974.0 | 0 |
| 973.0 | 0 |
| 972.0 | 0 |
| 971.0 | 0 |
| 970.0 | 0 |
| 969.0 | 0 |
| 968.0 | 0 |
| 967.0 | 0 |
| 966.0 | 0 |
| 965.0 | 0 |
| 964.0 | 0 |
| 963.0 | 0 |
| 962.0 | 0 |
| 961.0 | 0 |
| 960.0 | 0 |
| 959.0 | 0 |
| 958.0 | 0 |
| 957.0 | 0 |
| 956.0 | 0 |
| 955.0 | 0 |
| 954.0 | 0 |
| 953.0 | 0 |
| 952.0 | 0 |
| 951.0 | 0 |
| 950.0 | 0 |
| 949.0 | 0 |
| 948.0 | 0 |
| 947.0 | 0 |
| 946.0 | 0 |
| 945.0 | 0 |
| 944.0 | 0 |
| 943.0 | 0 |
| 942.0 | 0 |
| 941.0 | 0 |
| 940.0 | 0 |
| 939.0 | 0 |
| 938.0 | 0 |
| 937.0 | 0 |
| 936.0 | 0 |
| 935.0 | 0 |
| 934.0 | 0 |
| 933.0 | 0 |
| 932.0 | 0 |
| 931.0 | 0 |
| 930.0 | 0 |
| 929.0 | 0 |
| 928.0 | 0 |
| 927.0 | 0 |
| 926.0 | 0 |
| 925.0 | 0 |
| 924.0 | 0 |
| 923.0 | 0 |
| 922.0 | 0 |
| 921.0 | 0 |
| 920.0 | 0 |
| 919.0 | 0 |
| 918.0 | 0 |
| 917.0 | 0 |
| 916.0 | 0 |
| 915.0 | 0 |
| 914.0 | 0 |
| 913.0 | 0 |
| 912.0 | 0 |
| 911.0 | 0 |
| 910.0 | 0 |
| 909.0 | 0 |
| 908.0 | 0 |
| 907.0 | 0 |
| 906.0 | 0 |
| 905.0 | 0 |
| 904.0 | 0 |
| 903.0 | 0 |
| 902.0 | 0 |
| 901.0 | 0 |
| 900.0 | 0 |
| 899.0 | 0 |
| 898.0 | 0 |
| 897.0 | 0 |
| 896.0 | 0 |
| 895.0 | 0 |
| 894.0 | 0 |
| 893.0 | 0 |
| 892.0 | 0 |
| 891.0 | 0 |
| 890.0 | 0 |
| 889.0 | 0 |
| 888.0 | 0 |
| 887.0 | 0 |
| 886.0 | 0 |
| 885.0 | 0 |
| 884.0 | 0 |
| 883.0 | 0 |
| 882.0 | 0 |
| 881.0 | 0 |
| 880.0 | 0 |
| 879.0 | 0 |
| 878.0 | 0 |
| 877.0 | 0 |
| 876.0 | 0 |
| 875.0 | 0 |
| 874.0 | 0 |
| 873.0 | 0 |
| 872.0 | 0 |
| 871.0 | 0 |
| 870.0 | 0 |
| 869.0 | 0 |
| 868.0 | 0 |
| 867.0 | 0 |
| 866.0 | 0 |
| 865.0 | 0 |
| 864.0 | 0.001 |
| 863.0 | 0.001 |
| 862.0 | 0.001 |
| 861.0 | 0.001 |
| 860.0 | 0.001 |
| 859.0 | 0 |
| 858.0 | 0.001 |
| 857.0 | 0.001 |
| 856.0 | 0.001 |
| 855.0 | 0.001 |
| 854.0 | 0.001 |
| 853.0 | 0.001 |
| 852.0 | 0.001 |
| 851.0 | 0.001 |
| 850.0 | 0.001 |
| 849.0 | 0.001 |
| 848.0 | 0.001 |
| 847.0 | 0.001 |
| 846.0 | 0.001 |
| 845.0 | 0.001 |
| 844.0 | 0.001 |
| 843.0 | 0.001 |
| 842.0 | 0.001 |
| 841.0 | 0.001 |
| 840.0 | 0.001 |
| 839.0 | 0.001 |
| 838.0 | 0.001 |
| 837.0 | 0.001 |
| 836.0 | 0.001 |
| 835.0 | 0.001 |
| 834.0 | 0.001 |
| 833.0 | 0.001 |
| 832.0 | 0.001 |
| 831.0 | 0.001 |
| 830.0 | 0.001 |
| 829.0 | 0.001 |
| 828.0 | 0.001 |
| 827.0 | 0.001 |
| 826.0 | 0.002 |
| 825.0 | 0.002 |
| 824.0 | 0.002 |
| 823.0 | 0.001 |
| 822.0 | 0.001 |
| 821.0 | 0.002 |
| 820.0 | 0.001 |
| 819.0 | 0.001 |
| 818.0 | 0.002 |
| 817.0 | 0.002 |
| 816.0 | 0.002 |
| 815.0 | 0.002 |
| 814.0 | 0.002 |
| 813.0 | 0.002 |
| 812.0 | 0.002 |
| 811.0 | 0.002 |
| 810.0 | 0.002 |
| 809.0 | 0.002 |
| 808.0 | 0.002 |
| 807.0 | 0.002 |
| 806.0 | 0.002 |
| 805.0 | 0.002 |
| 804.0 | 0.002 |
| 803.0 | 0.002 |
| 802.0 | 0.002 |
| 801.0 | 0.002 |
| 800.0 | 0.003 |
| 799.0 | 0 |
| 798.0 | 0 |
| 797.0 | 0 |
| 796.0 | 0 |
| 795.0 | 0 |
| 794.0 | 0 |
| 793.0 | 0 |
| 792.0 | 0 |
| 791.0 | 0 |
| 790.0 | 0 |
| 789.0 | 0 |
| 788.0 | 0 |
| 787.0 | 0 |
| 786.0 | 0 |
| 785.0 | 0 |
| 784.0 | 0 |
| 783.0 | 0 |
| 782.0 | 0 |
| 781.0 | 0 |
| 780.0 | 0 |
| 779.0 | 0 |
| 778.0 | 0 |
| 777.0 | 0 |
| 776.0 | 0 |
| 775.0 | 0 |
| 774.0 | 0 |
| 773.0 | 0 |
| 772.0 | 0 |
| 771.0 | 0 |
| 770.0 | 0 |
| 769.0 | 0 |
| 768.0 | 0 |
| 767.0 | 0 |
| 766.0 | 0 |
| 765.0 | 0 |
| 764.0 | 0 |
| 763.0 | 0 |
| 762.0 | 0 |
| 761.0 | 0 |
| 760.0 | 0 |
| 759.0 | 0 |
| 758.0 | 0 |
| 757.0 | 0 |
| 756.0 | 0 |
| 755.0 | 0 |
| 754.0 | 0 |
| 753.0 | 0 |
| 752.0 | 0 |
| 751.0 | 0 |
| 750.0 | 0 |
| 749.0 | 0 |
| 748.0 | 0 |
| 747.0 | 0 |
| 746.0 | 0 |
| 745.0 | 0 |
| 744.0 | 0 |
| 743.0 | 0 |
| 742.0 | 0 |
| 741.0 | 0 |
| 740.0 | 0 |
| 739.0 | 0 |
| 738.0 | 0 |
| 737.0 | 0 |
| 736.0 | 0 |
| 735.0 | 0 |
| 734.0 | 0 |
| 733.0 | 0 |
| 732.0 | 0 |
| 731.0 | 0 |
| 730.0 | 0 |
| 729.0 | 0 |
| 728.0 | 0 |
| 727.0 | 0 |
| 726.0 | 0 |
| 725.0 | 0 |
| 724.0 | 0 |
| 723.0 | 0 |
| 722.0 | 0 |
| 721.0 | 0 |
| 720.0 | 0 |
| 719.0 | 0 |
| 718.0 | 0 |
| 717.0 | 0 |
| 716.0 | 0 |
| 715.0 | 0 |
| 714.0 | 0 |
| 713.0 | 0 |
| 712.0 | 0 |
| 711.0 | 0 |
| 710.0 | 0 |
| 709.0 | 0 |
| 708.0 | 0 |
| 707.0 | 0 |
| 706.0 | 0 |
| 705.0 | 0 |
| 704.0 | 0 |
| 703.0 | 0 |
| 702.0 | 0 |
| 701.0 | 0 |
| 700.0 | 0 |
| 699.0 | 0 |
| 698.0 | 0 |
| 697.0 | 0 |
| 696.0 | 0 |
| 695.0 | 0 |
| 694.0 | 0 |
| 693.0 | 0 |
| 692.0 | 0 |
| 691.0 | 0 |
| 690.0 | 0 |
| 689.0 | 0 |
| 688.0 | 0 |
| 687.0 | 0 |
| 686.0 | 0 |
| 685.0 | 0 |
| 684.0 | 0 |
| 683.0 | 0 |
| 682.0 | 0 |
| 681.0 | 0 |
| 680.0 | 0 |
| 679.0 | 0 |
| 678.0 | 0 |
| 677.0 | 0 |
| 676.0 | 0 |
| 675.0 | 0 |
| 674.0 | 0 |
| 673.0 | 0 |
| 672.0 | 0 |
| 671.0 | 0 |
| 670.0 | 0 |
| 669.0 | 0 |
| 668.0 | 0 |
| 667.0 | 0 |
| 666.0 | 0 |
| 665.0 | 0 |
| 664.0 | 0 |
| 663.0 | 0 |
| 662.0 | 0 |
| 661.0 | 0 |
| 660.0 | 0 |
| 659.0 | 0 |
| 658.0 | 0 |
| 657.0 | 0 |
| 656.0 | 0 |
| 655.0 | 0 |
| 654.0 | 0 |
| 653.0 | 0 |
| 652.0 | 0 |
| 651.0 | 0 |
| 650.0 | 0 |
| 649.0 | 0 |
| 648.0 | 0 |
| 647.0 | 0 |
| 646.0 | 0 |
| 645.0 | 0 |
| 644.0 | 0 |
| 643.0 | 0 |
| 642.0 | 0 |
| 641.0 | 0 |
| 640.0 | 0 |
| 639.0 | 0 |
| 638.0 | 0 |
| 637.0 | 0 |
| 636.0 | 0 |
| 635.0 | 0 |
| 634.0 | 0 |
| 633.0 | 0 |
| 632.0 | 0 |
| 631.0 | 0 |
| 630.0 | 0 |
| 629.0 | 0 |
| 628.0 | 0 |
| 627.0 | 0 |
| 626.0 | 0 |
| 625.0 | 0 |
| 624.0 | 0 |
| 623.0 | 0 |
| 622.0 | 0 |
| 621.0 | 0 |
| 620.0 | 0 |
| 619.0 | 0 |
| 618.0 | 0 |
| 617.0 | 0 |
| 616.0 | 0 |
| 615.0 | 0 |
| 614.0 | 0 |
| 613.0 | 0 |
| 612.0 | 0 |
| 611.0 | 0 |
| 610.0 | 0 |
| 609.0 | 0 |
| 608.0 | 0 |
| 607.0 | 0 |
| 606.0 | 0 |
| 605.0 | 0 |
| 604.0 | 0 |
| 603.0 | 0 |
| 602.0 | 0 |
| 601.0 | 0 |
| 600.0 | 0 |
| 599.0 | 0 |
| 598.0 | 0 |
| 597.0 | 0 |
| 596.0 | 0 |
| 595.0 | 0 |
| 594.0 | 0 |
| 593.0 | 0 |
| 592.0 | 0 |
| 591.0 | 0 |
| 590.0 | 0 |
| 589.0 | 0 |
| 588.0 | 0 |
| 587.0 | 0 |
| 586.0 | 0 |
| 585.0 | 0 |
| 584.0 | 0 |
| 583.0 | 0 |
| 582.0 | 0 |
| 581.0 | 0 |
| 580.0 | 0 |
| 579.0 | 0 |
| 578.0 | 0 |
| 577.0 | 0 |
| 576.0 | 0 |
| 575.0 | 0 |
| 574.0 | 0 |
| 573.0 | 0 |
| 572.0 | 0 |
| 571.0 | 0 |
| 570.0 | 0 |
| 569.0 | 0 |
| 568.0 | 0 |
| 567.0 | 0 |
| 566.0 | 0 |
| 565.0 | 0 |
| 564.0 | 0 |
| 563.0 | 0 |
| 562.0 | 0 |
| 561.0 | 0 |
| 560.0 | 0 |
| 559.0 | 0 |
| 558.0 | 0 |
| 557.0 | 0 |
| 556.0 | 0 |
| 555.0 | 0 |
| 554.0 | 0 |
| 553.0 | 0 |
| 552.0 | 0 |
| 551.0 | 0 |
| 550.0 | 0 |
| 549.0 | 0 |
| 548.0 | 0 |
| 547.0 | 0 |
| 546.0 | 0 |
| 545.0 | 0 |
| 544.0 | 0 |
| 543.0 | 0 |
| 542.0 | 0 |
| 541.0 | 0 |
| 540.0 | 0 |
| 539.0 | 0 |
| 538.0 | 0 |
| 537.0 | 0 |
| 536.0 | 0 |
| 535.0 | 0 |
| 534.0 | 0 |
| 533.0 | 0 |
| 532.0 | 0 |
| 531.0 | 0 |
| 530.0 | 0 |
| 529.0 | 0 |
| 528.0 | 0 |
| 527.0 | 0 |
| 526.0 | 0 |
| 525.0 | 0 |
| 524.0 | 0 |
| 523.0 | 0 |
| 522.0 | 0 |
| 521.0 | 0 |
| 520.0 | 0 |
| 519.0 | 0 |
| 518.0 | 0 |
| 517.0 | 0 |
| 516.0 | 0 |
| 515.0 | 0 |
| 514.0 | 0 |
| 513.0 | 0 |
| 512.0 | 0 |
| 511.0 | 0 |
| 510.0 | 0 |
| 509.0 | 0 |
| 508.0 | 0 |
| 507.0 | 0 |
| 506.0 | 0 |
| 505.0 | 0 |
| 504.0 | 0 |
| 503.0 | 0 |
| 502.0 | 0 |
| 501.0 | 0 |
| 500.0 | 0 |
| 499.0 | 0 |
| 498.0 | 0 |
| 497.0 | 0 |
| 496.0 | 0 |
| 495.0 | 0 |
| 494.0 | 0 |
| 493.0 | 0 |
| 492.0 | 0 |
| 491.0 | 0 |
| 490.0 | 0 |
| 489.0 | 0 |
| 488.0 | 0 |
| 487.0 | 0 |
| 486.0 | 0 |
| 485.0 | 0 |
| 484.0 | 0 |
| 483.0 | 0 |
| 482.0 | 0 |
| 481.0 | 0 |
| 480.0 | 0 |
| 479.0 | 0 |
| 478.0 | 0 |
| 477.0 | 0 |
| 476.0 | 0 |
| 475.0 | 0 |
| 474.0 | 0 |
| 473.0 | 0 |
| 472.0 | 0 |
| 471.0 | 0 |
| 470.0 | 0 |
| 469.0 | 0 |
| 468.0 | 0 |
| 467.0 | 0 |
| 466.0 | 0 |
| 465.0 | 0 |
| 464.0 | 0 |
| 463.0 | 0 |
| 462.0 | 0 |
| 461.0 | 0 |
| 460.0 | 0 |
| 459.0 | 0 |
| 458.0 | 0 |
| 457.0 | 0 |
| 456.0 | 0 |
| 455.0 | 0 |
| 454.0 | 0 |
| 453.0 | 0 |
| 452.0 | 0 |
| 451.0 | 0 |
| 450.0 | 0 |
| 449.0 | 0 |
| 448.0 | 0 |
| 447.0 | 0 |
| 446.0 | 0 |
| 445.0 | 0 |
| 444.0 | 0 |
| 443.0 | 0 |
| 442.0 | 0 |
| 441.0 | 0 |
| 440.0 | 0 |
| 439.0 | 0 |
| 438.0 | 0 |
| 437.0 | 0 |
| 436.0 | 0 |
| 435.0 | 0 |
| 434.0 | 0.001 |
| 433.0 | 0.001 |
| 432.0 | 0.001 |
| 431.0 | 0.001 |
| 430.0 | 0.002 |
| 429.0 | 0.002 |
| 428.0 | 0.002 |
| 427.0 | 0.002 |
| 426.0 | 0.002 |
| 425.0 | 0.002 |
| 424.0 | 0.002 |
| 423.0 | 0.002 |
| 422.0 | 0.002 |
| 421.0 | 0.003 |
| 420.0 | 0.003 |
| 419.0 | 0.003 |
| 418.0 | 0.004 |
| 417.0 | 0.004 |
| 416.0 | 0.005 |
| 415.0 | 0.006 |
| 414.0 | 0.007 |
| 413.0 | 0.009 |
| 412.0 | 0.011 |
| 411.0 | 0.013 |
| 410.0 | 0.017 |
| 409.0 | 0.021 |
| 408.0 | 0.027 |
| 407.0 | 0.035 |
| 406.0 | 0.047 |
| 405.0 | 0.064 |
| 404.0 | 0.09 |
| 403.0 | 0.13 |
| 402.0 | 0.197 |
| 401.0 | 0.31 |
| 400.0 | 0.515 |
| 399.0 | 0.909 |
| 398.0 | 1.695 |
| 397.0 | 3.394 |
| 396.0 | 6.993 |
| 395.0 | 13.337 |
| 394.0 | 21.406 |
| 393.0 | 27.984 |
| 392.0 | 31.119 |
| 391.0 | 31.578 |
| 390.0 | 30.936 |
| 389.0 | 29.793 |
| 388.0 | 27.888 |
| 387.0 | 24.538 |
| 386.0 | 19.053 |
| 385.0 | 12.365 |
| 384.0 | 6.43 |
| 383.0 | 2.886 |
| 382.0 | 1.236 |
| 381.0 | 0.547 |
| 380.0 | 0.258 |
| 379.0 | 0.129 |
| 378.0 | 0.069 |
| 377.0 | 0.039 |
| 376.0 | 0.023 |
| 375.0 | 0.014 |
| 374.0 | 0.009 |
| 373.0 | 0.006 |
| 372.0 | 0.004 |
| 371.0 | 0.002 |
| 370.0 | 0.002 |
| 369.0 | 0.001 |
| 368.0 | 0.001 |
| 367.0 | 0 |
| 366.0 | 0 |
| 365.0 | 0 |
| 364.0 | 0 |
| 363.0 | 0 |
| 362.0 | 0 |
| 361.0 | 0 |
| 360.0 | 0 |
| 359.0 | 0 |
| 358.0 | 0 |
| 357.0 | 0 |
| 356.0 | 0 |
| 355.0 | 0 |
| 354.0 | 0 |
| 353.0 | 0 |
| 352.0 | 0 |
| 351.0 | 0 |
| 350.0 | 0 |
| 349.0 | 0 |
| 348.0 | 0 |
| 347.0 | 0 |
| 346.0 | 0 |
| 345.0 | 0 |
| 344.0 | 0 |
| 343.0 | 0 |
| 342.0 | 0 |
| 341.0 | 0 |
| 340.0 | 0 |
| 339.0 | 0 |
| 338.0 | 0 |
| 337.0 | 0 |
| 336.0 | 0 |
| 335.0 | 0 |
| 334.0 | 0 |
| 333.0 | 0 |
| 332.0 | 0 |
| 331.0 | 0 |
| 330.0 | 0 |
| 329.0 | 0 |
| 328.0 | 0 |
| 327.0 | 0 |
| 326.0 | 0 |
| 325.0 | 0 |
| 324.0 | 0 |
| 323.0 | 0 |
| 322.0 | 0 |
| 321.0 | 0 |
| 320.0 | 0 |
| 319.0 | 0 |
| 318.0 | 0 |
| 317.0 | 0 |
| 316.0 | 0 |
| 315.0 | 0 |
| 314.0 | 0 |
| 313.0 | 0 |
| 312.0 | 0 |
| 311.0 | 0 |
| 310.0 | 0 |
| 309.0 | 0 |
| 308.0 | 0 |
| 307.0 | 0 |
| 306.0 | 0 |
| 305.0 | 0 |
| 304.0 | 0 |
| 303.0 | 0 |
| 302.0 | 0 |
| 301.0 | 0 |
| 300.0 | 0 |
| 299.0 | 0 |
| 298.0 | 0 |
| 297.0 | 0 |
| 296.0 | 0 |
| 295.0 | 0 |
| 294.0 | 0 |
| 293.0 | 0 |
| 292.0 | 0 |
| 291.0 | 0 |
| 290.0 | 0 |
| 289.0 | 0 |
| 288.0 | 0 |
| 287.0 | 0 |
| 286.0 | 0 |
| 285.0 | 0 |
| 284.0 | 0 |
| 283.0 | 0 |
| 282.0 | 0 |
| 281.0 | 0 |
| 280.0 | 0 |
| 279.0 | 0 |
| 278.0 | 0 |
| 277.0 | 0 |
| 276.0 | 0 |
| 275.0 | 0 |
| 274.0 | 0 |
| 273.0 | 0 |
| 272.0 | 0 |
| 271.0 | 0 |
| 270.0 | 0 |
| 269.0 | 0 |
| 268.0 | 0 |
| 267.0 | 0 |
| 266.0 | 0 |
| 265.0 | 0 |
| 264.0 | 0 |
| 263.0 | 0 |
| 262.0 | 0 |
| 261.0 | 0 |
| 260.0 | 0 |
| 259.0 | 0 |
| 258.0 | 0 |
| 257.0 | 0 |
| 256.0 | 0 |
| 255.0 | 0 |
| 254.0 | 0 |
| 253.0 | 0 |
| 252.0 | 0 |
| 251.0 | 0 |
| 250.0 | 0 |
| 249.0 | 0 |
| 248.0 | 0 |
| 247.0 | 0 |
| 246.0 | 0 |
| 245.0 | 0 |
| 244.0 | 0 |
| 243.0 | 0 |
| 242.0 | 0 |
| 241.0 | 0 |
| 240.0 | 0 |
| 239.0 | 0 |
| 238.0 | 0 |
| 237.0 | 0 |
| 236.0 | 0 |
| 235.0 | 0 |
| 234.0 | 0 |
| 233.0 | 0 |
| 232.0 | 0 |
| 231.0 | 0 |
| 230.0 | 0 |
| 229.0 | 0 |
| 228.0 | 0 |
| 227.0 | 0 |
| 226.0 | 0 |
| 225.0 | 0 |
| 224.0 | 0 |
| 223.0 | 0 |
| 222.0 | 0 |
| 221.0 | 0 |
| 220.0 | 0 |
| 219.0 | 0 |
| 218.0 | 0 |
| 217.0 | 0 |
| 216.0 | 0 |
| 215.0 | 0 |
| 214.0 | 0 |
| 213.0 | 0 |
| 212.0 | 0 |
| 211.0 | 0 |
| 210.0 | 0 |
| 209.0 | 0 |
| 208.0 | 0 |
| 207.0 | 0 |
| 206.0 | 0 |
| 205.0 | 0 |
| 204.0 | 0 |
| 203.0 | 0 |
| 202.0 | 0 |
| 201.0 | 0 |